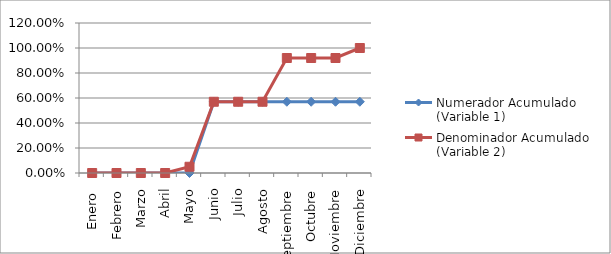
| Category | Numerador Acumulado (Variable 1) | Denominador Acumulado (Variable 2) |
|---|---|---|
| Enero  | 0 | 0 |
| Febrero | 0 | 0 |
| Marzo | 0 | 0 |
| Abril | 0 | 0 |
| Mayo | 0 | 0.05 |
| Junio | 0.57 | 0.57 |
| Julio | 0.57 | 0.57 |
| Agosto | 0.57 | 0.57 |
| Septiembre | 0.57 | 0.92 |
| Octubre | 0.57 | 0.92 |
| Noviembre | 0.57 | 0.92 |
| Diciembre | 0.57 | 1 |